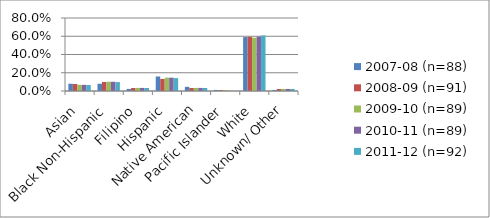
| Category | 2007-08 (n=88) | 2008-09 (n=91) | 2009-10 (n=89) | 2010-11 (n=89) | 2011-12 (n=92) |
|---|---|---|---|---|---|
| Asian | 0.08 | 0.077 | 0.067 | 0.067 | 0.065 |
| Black Non-Hispanic | 0.08 | 0.099 | 0.101 | 0.101 | 0.098 |
| Filipino | 0.023 | 0.033 | 0.034 | 0.034 | 0.033 |
| Hispanic | 0.159 | 0.132 | 0.146 | 0.146 | 0.141 |
| Native American | 0.045 | 0.033 | 0.034 | 0.034 | 0.033 |
| Pacific Islander | 0.011 | 0.011 | 0.011 | 0 | 0 |
| White | 0.591 | 0.593 | 0.584 | 0.596 | 0.609 |
| Unknown/ Other | 0.011 | 0.022 | 0.022 | 0.022 | 0.022 |